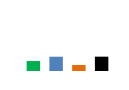
| Category | East |
|---|---|
| Chewbacca | 61224.92 |
| Hansolo | 87732.648 |
| James Kirk | 37177.903 |
| Luke Skywalker | 88034.051 |